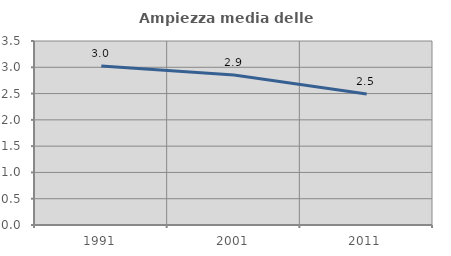
| Category | Ampiezza media delle famiglie |
|---|---|
| 1991.0 | 3.026 |
| 2001.0 | 2.855 |
| 2011.0 | 2.49 |